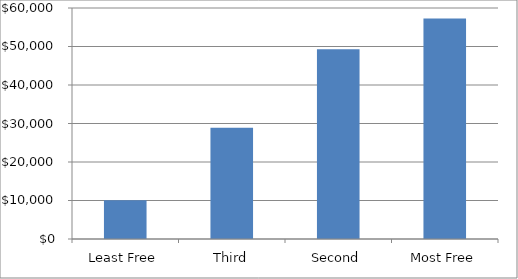
| Category | Series 0 |
|---|---|
| Least Free | 10079.297 |
| Third | 28889.124 |
| Second | 49308.391 |
| Most Free | 57269.249 |